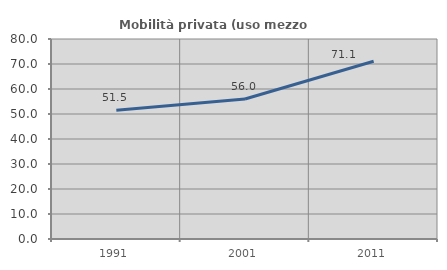
| Category | Mobilità privata (uso mezzo privato) |
|---|---|
| 1991.0 | 51.515 |
| 2001.0 | 56 |
| 2011.0 | 71.084 |